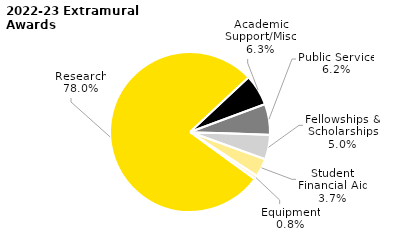
| Category | Series 0 |
|---|---|
| Research | 438.033 |
| Academic Support/Misc | 35.324 |
| Public Service | 35.011 |
| Fellowships & Scholarships | 27.895 |
| Student Financial Aid | 20.776 |
| Equipment | 4.256 |